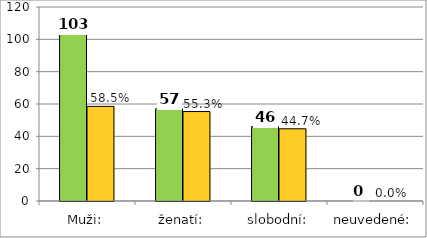
| Category | Series 0 | Series 1 |
|---|---|---|
| Muži: | 103 | 58.523 |
| ženatí: | 57 | 55.34 |
| slobodní: | 46 | 44.66 |
| neuvedené: | 0 | 0 |